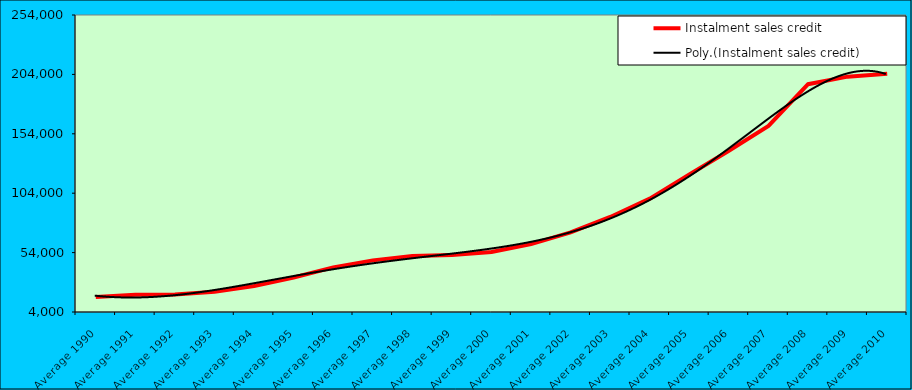
| Category | Instalment sales credit |
|---|---|
| Average 1990 | 16662.083 |
| Average 1991 | 18433.083 |
| Average 1992 | 18768.5 |
| Average 1993 | 20959.083 |
| Average 1994 | 25954 |
| Average 1995 | 33013.417 |
| Average 1996 | 41532.333 |
| Average 1997 | 47453.833 |
| Average 1998 | 51143.5 |
| Average 1999 | 51879.091 |
| Average 2000 | 54488.667 |
| Average 2001 | 61161.364 |
| Average 2002 | 70966.333 |
| Average 2003 | 84007.167 |
| Average 2004 | 99388 |
| Average 2005 | 119700.667 |
| Average 2006 | 139721.667 |
| Average 2007 | 160597.833 |
| Average 2008 | 195741.083 |
| Average 2009 | 202100.667 |
| Average 2010 | 204550.625 |